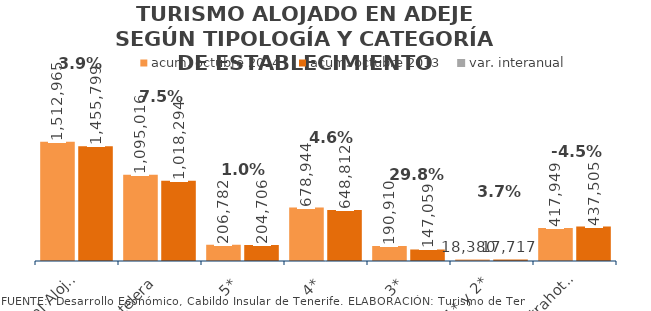
| Category | acum. octubre 2014 | acum. octubre 2013 |
|---|---|---|
| Total Alojados | 1512965 | 1455799 |
| Hotelera | 1095016 | 1018294 |
| 5* | 206782 | 204706 |
| 4* | 678944 | 648812 |
| 3* | 190910 | 147059 |
| 1* y 2* | 18380 | 17717 |
| Extrahotelera | 417949 | 437505 |